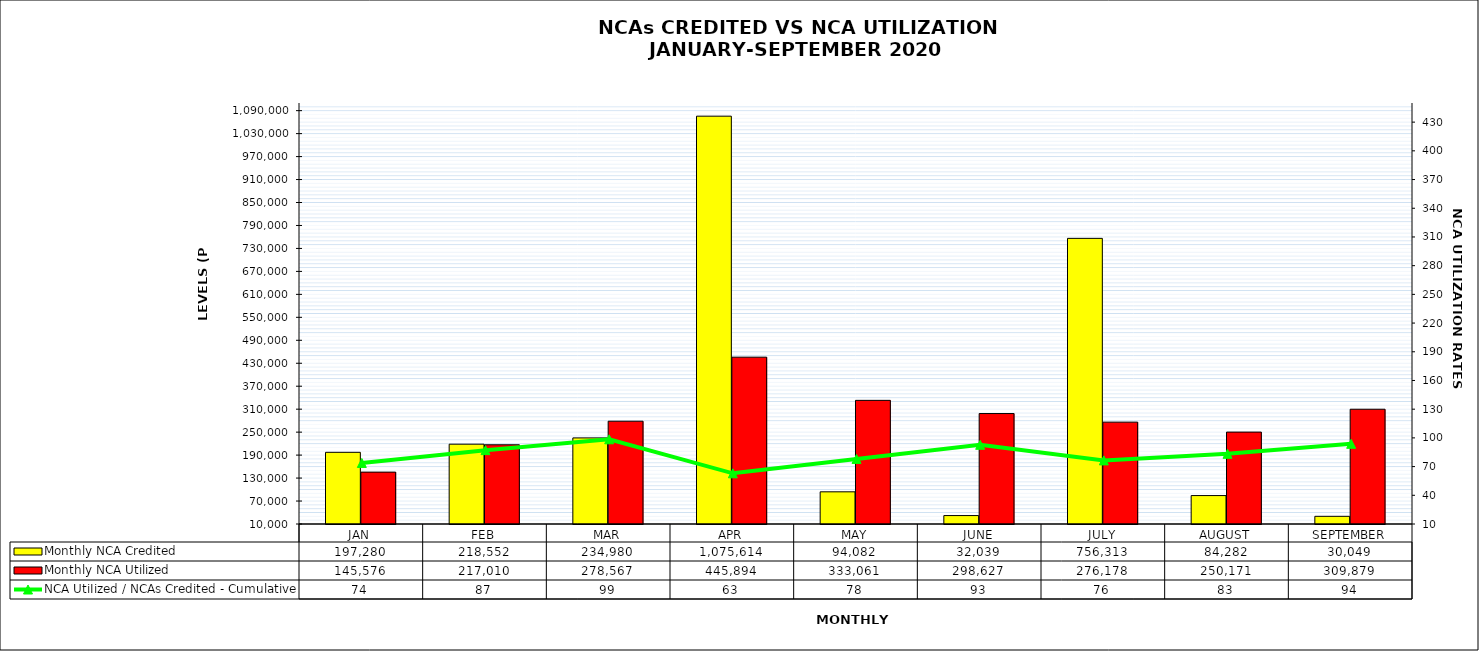
| Category | Monthly NCA Credited | Monthly NCA Utilized |
|---|---|---|
| JAN | 197280.374 | 145576.105 |
| FEB | 218551.98 | 217009.915 |
| MAR | 234979.639 | 278567.463 |
| APR | 1075614.497 | 445894.359 |
| MAY | 94082.131 | 333061.393 |
| JUNE | 32038.674 | 298626.93 |
| JULY | 756312.933 | 276177.539 |
| AUGUST | 84282.483 | 250170.732 |
| SEPTEMBER | 30049.258 | 309878.518 |